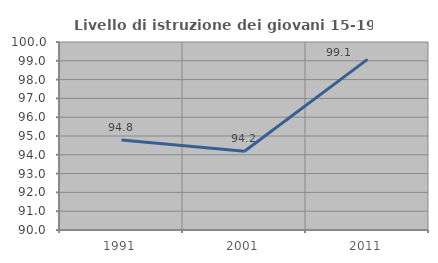
| Category | Livello di istruzione dei giovani 15-19 anni |
|---|---|
| 1991.0 | 94.783 |
| 2001.0 | 94.186 |
| 2011.0 | 99.074 |